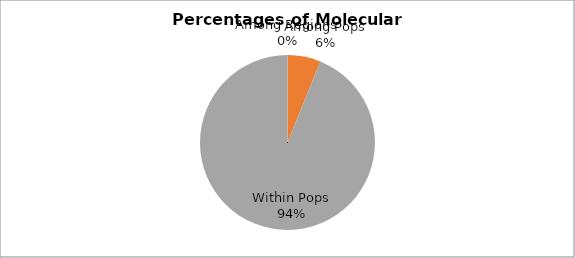
| Category | Est. Var. |
|---|---|
| Among Regions | 0 |
| Among Pops | 0.044 |
| Within Pops | 0.68 |